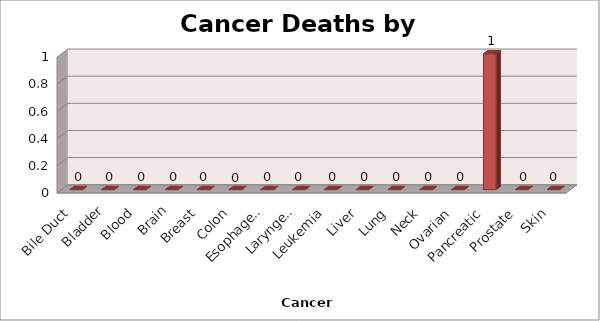
| Category | Series 0 |
|---|---|
| Bile Duct | 0 |
| Bladder | 0 |
| Blood | 0 |
| Brain | 0 |
| Breast | 0 |
| Colon | 0 |
| Esophageal | 0 |
| Laryngeal | 0 |
| Leukemia | 0 |
| Liver | 0 |
| Lung | 0 |
| Neck | 0 |
| Ovarian | 0 |
| Pancreatic | 1 |
| Prostate | 0 |
| Skin | 0 |